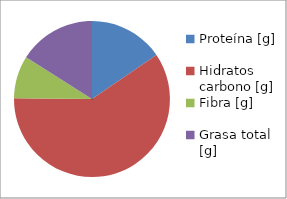
| Category | Series 0 |
|---|---|
| Proteína [g] | 67.961 |
| Hidratos carbono [g] | 262.374 |
| Fibra [g] | 38.683 |
| Grasa total [g] | 70.391 |